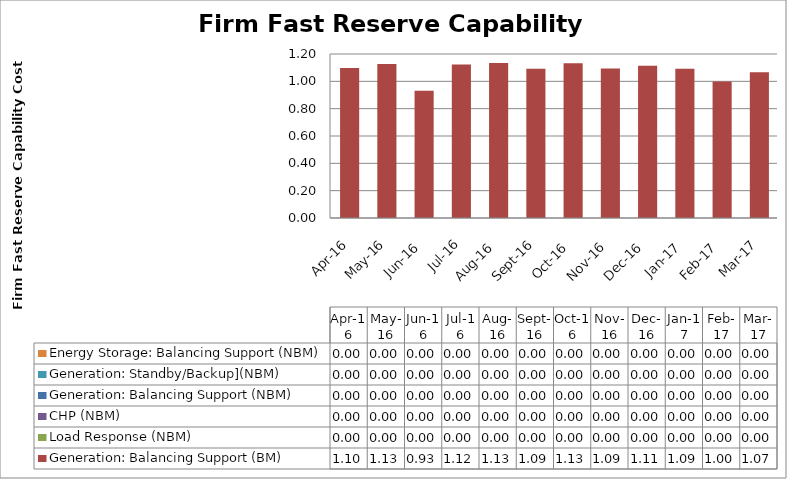
| Category | Generation: Balancing Support (BM) | Load Response (NBM) | CHP (NBM) | Generation: Balancing Support (NBM) | Generation: Standby/Backup](NBM) | Energy Storage: Balancing Support (NBM) |
|---|---|---|---|---|---|---|
| 2016-04-01 | 1.098 | 0 | 0 | 0 | 0 | 0 |
| 2016-05-01 | 1.127 | 0 | 0 | 0 | 0 | 0 |
| 2016-06-01 | 0.93 | 0 | 0 | 0 | 0 | 0 |
| 2016-07-01 | 1.123 | 0 | 0 | 0 | 0 | 0 |
| 2016-08-01 | 1.134 | 0 | 0 | 0 | 0 | 0 |
| 2016-09-01 | 1.093 | 0 | 0 | 0 | 0 | 0 |
| 2016-10-01 | 1.133 | 0 | 0 | 0 | 0 | 0 |
| 2016-11-01 | 1.095 | 0 | 0 | 0 | 0 | 0 |
| 2016-12-01 | 1.115 | 0 | 0 | 0 | 0 | 0 |
| 2017-01-01 | 1.092 | 0 | 0 | 0 | 0 | 0 |
| 2017-02-01 | 0.998 | 0 | 0 | 0 | 0 | 0 |
| 2017-03-01 | 1.066 | 0 | 0 | 0 | 0 | 0 |